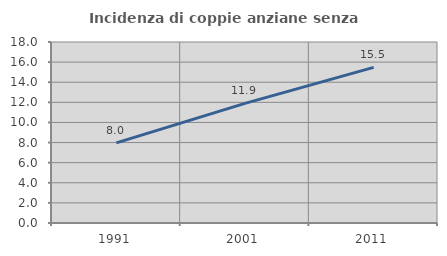
| Category | Incidenza di coppie anziane senza figli  |
|---|---|
| 1991.0 | 7.97 |
| 2001.0 | 11.892 |
| 2011.0 | 15.479 |